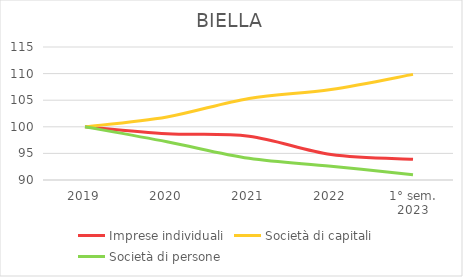
| Category | Imprese individuali | Società di capitali | Società di persone |
|---|---|---|---|
| 2019 | 100 | 100 | 100 |
| 2020 | 98.698 | 101.859 | 97.194 |
| 2021 | 98.231 | 105.331 | 94.074 |
| 2022 | 94.791 | 107.015 | 92.585 |
| 1° sem.
2023 | 93.897 | 109.856 | 90.982 |